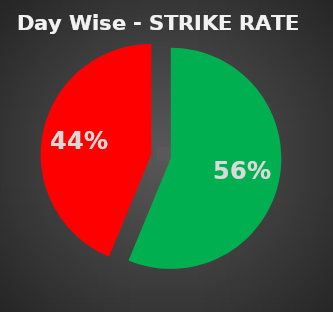
| Category | Series 0 |
|---|---|
| 0 | 0.562 |
| 1 | 0.438 |